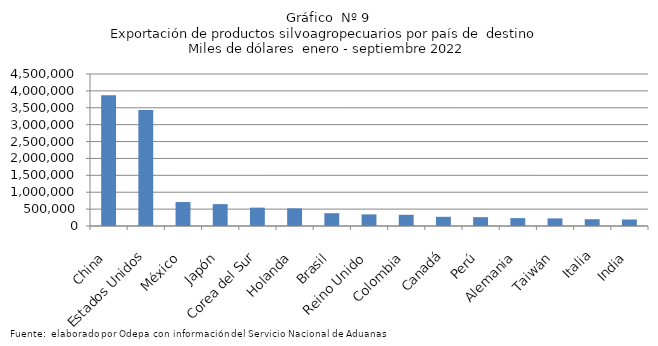
| Category | Series 0 |
|---|---|
| China | 3873508.268 |
| Estados Unidos | 3434551.23 |
| México | 709132.282 |
| Japón | 647777.222 |
| Corea del Sur | 544009.112 |
| Holanda | 522681.817 |
| Brasil | 378457.266 |
| Reino Unido | 344083.235 |
| Colombia | 331384.219 |
| Canadá | 272114.429 |
| Perú | 261495.965 |
| Alemania | 233600.561 |
| Taiwán | 225624.516 |
| Italia | 200671.436 |
| India | 192362.835 |